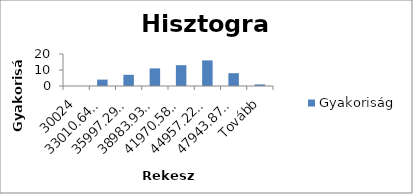
| Category | Gyakoriság |
|---|---|
| 30024 | 0 |
| 33010,64538 | 4 |
| 35997,29076 | 7 |
| 38983,93614 | 11 |
| 41970,58152 | 13 |
| 44957,2269 | 16 |
| 47943,87228 | 8 |
| Tovább | 1 |